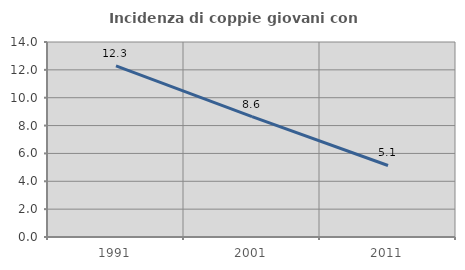
| Category | Incidenza di coppie giovani con figli |
|---|---|
| 1991.0 | 12.287 |
| 2001.0 | 8.647 |
| 2011.0 | 5.133 |